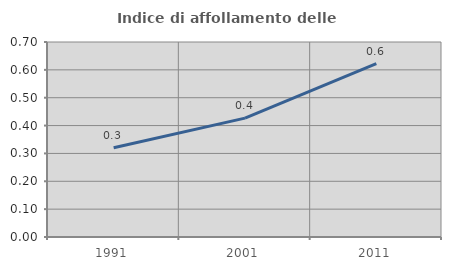
| Category | Indice di affollamento delle abitazioni  |
|---|---|
| 1991.0 | 0.32 |
| 2001.0 | 0.427 |
| 2011.0 | 0.623 |